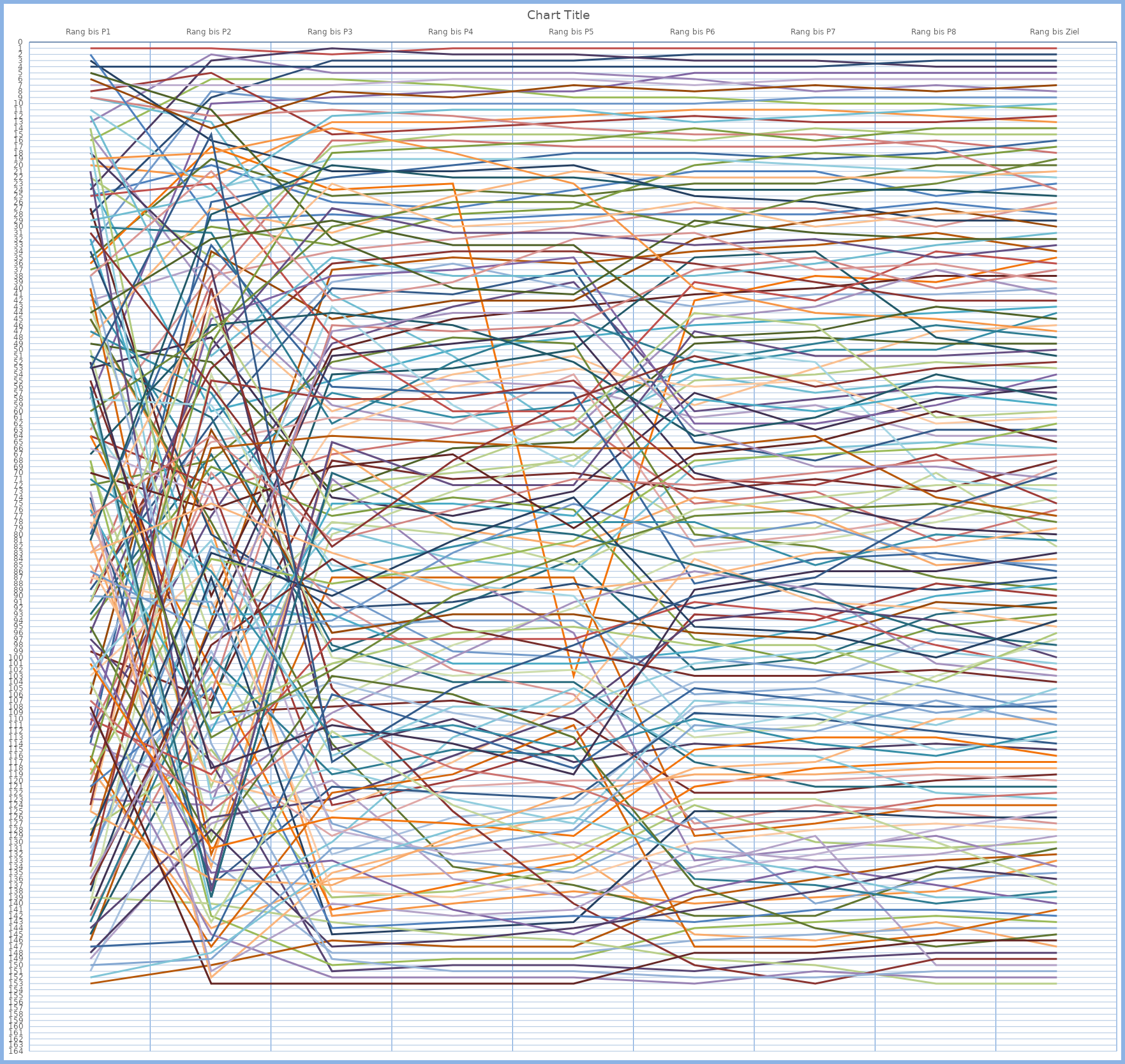
| Category | 1 | 2 | 3 | 4 | 5 | 6 | 7 | 8 | 9 | 10 | 11 | 12 | 13 | 14 | 15 | 16 | 17 | 18 | 19 | 20 | 21 | 22 | 23 | 24 | 25 | 26 | 27 | 28 | 29 | 30 | 31 | 32 | 33 | 34 | 35 | 36 | 37 | 38 | 39 | 40 | 41 | 42 | 43 | 44 | 45 | 46 | 47 | 48 | 49 | 50 | 51 | 52 | 53 | 54 | 55 | 56 | 57 | 58 | 59 | 60 | 61 | 62 | 63 | 64 | 65 | 66 | 67 | 68 | 69 | 70 | 71 | 72 | 73 | 74 | 75 | 76 | 77 | 78 | 79 | 80 | 81 | 82 | 83 | 84 | 85 | 86 | 87 | 88 | 89 | 90 | 91 | 92 | 93 | 94 | 95 | 96 | 97 | 98 | 99 | 100 | 101 | 102 | 103 | 104 | 105 | 106 | 107 | 108 | 109 | 110 | 111 | 112 | 113 | 114 | 115 | 116 | 117 | 118 | 119 | 120 | 121 | 122 | 123 | 124 | 125 | 126 | 127 | 128 | 129 | 130 | 131 | 132 | 133 | 134 | 135 | 136 | 137 | 138 | 139 | 140 | 141 | 142 | 143 | 144 | 145 | 146 | 147 | 148 | 149 | 150 | 151 | 152 | 153 | 154 | 155 | 156 | 157 | 158 | 159 | 160 | 161 | 162 | 163 |
|---|---|---|---|---|---|---|---|---|---|---|---|---|---|---|---|---|---|---|---|---|---|---|---|---|---|---|---|---|---|---|---|---|---|---|---|---|---|---|---|---|---|---|---|---|---|---|---|---|---|---|---|---|---|---|---|---|---|---|---|---|---|---|---|---|---|---|---|---|---|---|---|---|---|---|---|---|---|---|---|---|---|---|---|---|---|---|---|---|---|---|---|---|---|---|---|---|---|---|---|---|---|---|---|---|---|---|---|---|---|---|---|---|---|---|---|---|---|---|---|---|---|---|---|---|---|---|---|---|---|---|---|---|---|---|---|---|---|---|---|---|---|---|---|---|---|---|---|---|---|---|---|---|---|---|---|---|---|---|---|---|---|---|---|
| Rang bis P1 | 25 | 1 | 16 | 58 | 23 | 20 | 28 | 99 | 35 | 24 | 93 | 146 | 33 | 88 | 22 | 13 | 9 | 118 | 114 | 8 | 37 | 113 | 41 | 36 | 105 | 63 | 50 | 42 | 11 | 125 | 3 | 27 | 49 | 53 | 145 | 106 | 132 | 9 | 69 | 15 | 127 | 48 | 89 | 91 | 72 | 97 | 30 | 40 | 131 | 83 | 135 | 7 | 62 | 87 | 2 | 25 | 68 | 111 | 32 | 45 | 34 | 55 | 45 | 18 | 51 | 153 | 133 | 112 | 128 | 123 | 12 | 81 | 80 | 64 | 94 | 96 | 47 | 64 | 100 | 120 | 43 | 149 | 17 | 85 | 138 | 70 | 5 | 141 | 67 | 122 | 90 | 142 | 139 | 114 | 57 | 75 | 74 | 124 | 60 | 144 | 143 | 116 | 151 | 78 | 140 | 66 | 58 | 103 | 121 | 110 | 119 | 98 | 76 | 19 | 4 | 137 | 95 | 148 | 56 | 130 | 86 | 107 | 14 | 109 | 29 | 125 | 147 | 134 | 117 | 21 | 71 | 101 | 38 | 38 | 104 | 73 | 102 | 79 | 129 | 108 | 44 | 52 | 81 | 6 | 150 | 77 | 91 | 136 | 152 | 83 | 53 | 31 | 61 |  |  |  |  |  |  |  |  |  |  |
| Rang bis P2 | 20 | 1 | 6 | 10 | 60 | 22 | 9 | 107 | 19 | 3 | 67 | 94 | 8 | 39 | 35 | 2 | 13 | 144 | 26 | 5 | 30 | 77 | 71 | 17 | 58 | 38 | 129 | 36 | 24 | 43 | 16 | 90 | 52 | 48 | 108 | 34 | 88 | 12 | 121 | 41 | 103 | 27 | 62 | 53 | 68 | 117 | 31 | 132 | 99 | 65 | 104 | 7 | 89 | 92 | 29 | 23 | 142 | 45 | 93 | 79 | 80 | 109 | 78 | 37 | 61 | 150 | 82 | 73 | 115 | 124 | 51 | 134 | 33 | 72 | 69 | 50 | 57 | 102 | 133 | 70 | 97 | 127 | 123 | 120 | 87 | 76 | 11 | 95 | 46 | 63 | 91 | 106 | 140 | 122 | 141 | 152 | 137 | 40 | 47 | 126 | 100 | 147 | 111 | 116 | 54 | 74 | 59 | 85 | 105 | 119 | 84 | 135 | 112 | 18 | 4 | 98 | 130 | 128 | 139 | 66 | 96 | 125 | 110 | 145 | 25 | 136 | 146 | 55 | 49 | 138 | 86 | 131 | 114 | 21 | 143 | 151 | 81 | 42 | 83 | 153 | 32 | 118 | 28 | 14 | 149 | 64 | 44 | 101 | 148 | 75 | 15 | 56 | 113 |  |  |  |  |  |  |  |  |  |  |
| Rang bis P3 | 26 | 2 | 6 | 9 | 55 | 13 | 3 | 68 | 25 | 1 | 99 | 37 | 10 | 16 | 17 | 5 | 41 | 136 | 22 | 15 | 33 | 49 | 57 | 24 | 39 | 34 | 80 | 53 | 19 | 60 | 21 | 50 | 73 | 74 | 54 | 45 | 95 | 11 | 72 | 59 | 79 | 31 | 40 | 36 | 52 | 151 | 62 | 87 | 132 | 61 | 107 | 7 | 43 | 63 | 28 | 48 | 150 | 38 | 93 | 142 | 92 | 108 | 114 | 115 | 98 | 146 | 89 | 67 | 139 | 71 | 35 | 66 | 56 | 124 | 77 | 27 | 86 | 141 | 148 | 91 | 78 | 120 | 118 | 125 | 145 | 69 | 32 | 51 | 44 | 96 | 127 | 46 | 143 | 109 | 130 | 135 | 121 | 105 | 30 | 123 | 119 | 122 | 104 | 129 | 100 | 128 | 85 | 138 | 144 | 97 | 88 | 133 | 75 | 14 | 4 | 84 | 103 | 147 | 70 | 64 | 94 | 110 | 101 | 152 | 12 | 137 | 106 | 58 | 18 | 65 | 113 | 126 | 149 | 42 | 112 | 140 | 116 | 23 | 90 | 153 | 29 | 111 | 20 | 8 | 131 | 81 | 76 | 47 | 134 | 83 | 117 | 82 | 102 |  |  |  |  |  |  |  |  |  |  |
| Rang bis P4 | 27 | 1 | 7 | 8 | 50 | 13 | 3 | 71 | 24 | 2 | 92 | 35 | 10 | 16 | 15 | 5 | 51 | 135 | 20 | 14 | 28 | 43 | 61 | 23 | 36 | 32 | 73 | 55 | 19 | 54 | 21 | 45 | 66 | 77 | 53 | 42 | 94 | 12 | 70 | 63 | 84 | 25 | 41 | 34 | 48 | 150 | 52 | 87 | 126 | 62 | 98 | 6 | 59 | 56 | 29 | 60 | 149 | 37 | 101 | 140 | 91 | 107 | 134 | 110 | 104 | 147 | 99 | 64 | 138 | 86 | 38 | 79 | 57 | 120 | 74 | 31 | 82 | 137 | 148 | 102 | 80 | 136 | 123 | 117 | 144 | 67 | 40 | 49 | 46 | 93 | 133 | 47 | 145 | 100 | 113 | 130 | 122 | 125 | 26 | 116 | 115 | 119 | 109 | 121 | 103 | 132 | 88 | 139 | 143 | 97 | 85 | 141 | 75 | 18 | 4 | 95 | 106 | 146 | 78 | 65 | 83 | 118 | 96 | 152 | 11 | 129 | 112 | 58 | 17 | 72 | 111 | 127 | 151 | 39 | 124 | 142 | 108 | 30 | 81 | 153 | 33 | 114 | 22 | 9 | 131 | 76 | 69 | 44 | 128 | 89 | 105 | 68 | 90 |  |  |  |  |  |  |  |  |  |  |
| Rang bis P5 | 24 | 1 | 9 | 8 | 48 | 12 | 3 | 70 | 25 | 2 | 84 | 36 | 10 | 17 | 15 | 5 | 64 | 132 | 18 | 13 | 27 | 39 | 59 | 103 | 40 | 30 | 67 | 56 | 19 | 51 | 20 | 43 | 65 | 73 | 50 | 42 | 94 | 14 | 68 | 63 | 86 | 21 | 37 | 34 | 49 | 150 | 45 | 87 | 124 | 54 | 92 | 6 | 69 | 53 | 28 | 60 | 149 | 35 | 101 | 138 | 88 | 110 | 137 | 117 | 104 | 147 | 100 | 61 | 134 | 96 | 38 | 82 | 57 | 114 | 76 | 31 | 78 | 133 | 148 | 106 | 85 | 139 | 127 | 107 | 143 | 79 | 41 | 47 | 52 | 93 | 135 | 46 | 146 | 91 | 105 | 125 | 123 | 140 | 26 | 109 | 116 | 111 | 112 | 120 | 102 | 130 | 90 | 136 | 142 | 97 | 81 | 145 | 77 | 23 | 4 | 99 | 113 | 144 | 80 | 66 | 75 | 121 | 95 | 152 | 11 | 122 | 118 | 55 | 16 | 72 | 115 | 129 | 151 | 32 | 131 | 141 | 108 | 29 | 74 | 153 | 33 | 119 | 22 | 7 | 128 | 71 | 62 | 44 | 126 | 89 | 98 | 58 | 83 |  |  |  |  |  |  |  |  |  |  |
| Rang bis P6 | 21 | 1 | 9 | 5 | 46 | 11 | 2 | 73 | 23 | 3 | 102 | 34 | 10 | 17 | 16 | 6 | 54 | 145 | 18 | 12 | 20 | 60 | 53 | 42 | 43 | 27 | 79 | 61 | 19 | 59 | 25 | 41 | 49 | 57 | 35 | 32 | 106 | 15 | 55 | 45 | 69 | 22 | 65 | 36 | 80 | 151 | 52 | 129 | 108 | 82 | 83 | 7 | 50 | 56 | 28 | 39 | 144 | 62 | 99 | 140 | 92 | 122 | 142 | 114 | 117 | 139 | 100 | 75 | 124 | 133 | 38 | 74 | 88 | 93 | 97 | 33 | 78 | 121 | 146 | 127 | 76 | 134 | 107 | 84 | 125 | 67 | 29 | 70 | 64 | 96 | 126 | 37 | 149 | 86 | 116 | 118 | 109 | 150 | 30 | 94 | 136 | 147 | 104 | 120 | 113 | 135 | 112 | 130 | 143 | 91 | 68 | 138 | 58 | 40 | 4 | 103 | 137 | 141 | 85 | 66 | 81 | 128 | 98 | 153 | 13 | 119 | 105 | 71 | 14 | 47 | 110 | 115 | 152 | 31 | 123 | 131 | 101 | 26 | 95 | 148 | 48 | 89 | 24 | 8 | 111 | 72 | 44 | 63 | 132 | 87 | 90 | 51 | 77 |  |  |  |  |  |  |  |  |  |  |
| Rang bis P7 | 21 | 1 | 10 | 5 | 45 | 11 | 2 | 71 | 23 | 3 | 100 | 33 | 9 | 17 | 14 | 8 | 57 | 146 | 19 | 13 | 18 | 58 | 50 | 38 | 41 | 27 | 79 | 59 | 20 | 53 | 26 | 40 | 48 | 63 | 34 | 29 | 105 | 15 | 54 | 43 | 66 | 22 | 68 | 39 | 82 | 149 | 49 | 127 | 106 | 80 | 81 | 6 | 52 | 55 | 28 | 42 | 143 | 62 | 95 | 139 | 88 | 122 | 142 | 115 | 121 | 136 | 102 | 73 | 130 | 131 | 36 | 77 | 84 | 94 | 101 | 32 | 85 | 118 | 145 | 124 | 74 | 129 | 108 | 91 | 125 | 65 | 31 | 75 | 61 | 97 | 140 | 35 | 150 | 89 | 116 | 117 | 110 | 153 | 25 | 92 | 137 | 147 | 104 | 120 | 111 | 132 | 109 | 128 | 141 | 93 | 67 | 134 | 60 | 44 | 4 | 103 | 144 | 138 | 90 | 64 | 78 | 126 | 98 | 151 | 12 | 119 | 107 | 72 | 16 | 51 | 114 | 113 | 152 | 37 | 123 | 133 | 99 | 30 | 96 | 148 | 47 | 86 | 24 | 7 | 112 | 70 | 46 | 69 | 135 | 83 | 87 | 56 | 76 |  |  |  |  |  |  |  |  |  |  |
| Rang bis P8 | 25 | 1 | 10 | 5 | 44 | 12 | 2 | 73 | 20 | 4 | 93 | 31 | 9 | 16 | 15 | 7 | 55 | 143 | 18 | 13 | 19 | 56 | 50 | 39 | 41 | 30 | 70 | 64 | 21 | 47 | 29 | 38 | 49 | 58 | 48 | 27 | 109 | 17 | 52 | 37 | 65 | 22 | 63 | 42 | 87 | 148 | 46 | 124 | 106 | 77 | 78 | 6 | 71 | 62 | 26 | 34 | 142 | 59 | 90 | 138 | 89 | 120 | 135 | 114 | 121 | 133 | 105 | 81 | 131 | 129 | 33 | 85 | 83 | 88 | 95 | 35 | 80 | 117 | 144 | 125 | 72 | 150 | 111 | 92 | 126 | 60 | 32 | 79 | 54 | 91 | 136 | 40 | 153 | 101 | 122 | 110 | 112 | 149 | 23 | 94 | 140 | 145 | 97 | 119 | 103 | 128 | 115 | 127 | 141 | 98 | 66 | 137 | 57 | 45 | 3 | 102 | 147 | 134 | 96 | 74 | 84 | 123 | 104 | 152 | 11 | 118 | 108 | 67 | 14 | 51 | 116 | 113 | 151 | 36 | 130 | 132 | 99 | 28 | 100 | 146 | 43 | 86 | 24 | 8 | 107 | 68 | 61 | 69 | 139 | 82 | 76 | 53 | 75 |  |  |  |  |  |  |  |  |  |  |
| Rang bis Ziel | 23 | 1 | 11 | 5 | 43 | 13 | 2 | 68 | 20 | 4 | 91 | 34 | 9 | 18 | 15 | 8 | 55 | 147 | 16 | 12 | 17 | 57 | 44 | 35 | 40 | 26 | 82 | 64 | 22 | 46 | 29 | 38 | 49 | 56 | 51 | 30 | 107 | 24 | 53 | 41 | 66 | 21 | 63 | 42 | 89 | 148 | 48 | 124 | 106 | 69 | 74 | 6 | 73 | 61 | 28 | 36 | 143 | 54 | 88 | 133 | 87 | 119 | 131 | 115 | 121 | 132 | 109 | 76 | 130 | 134 | 31 | 84 | 86 | 90 | 93 | 33 | 81 | 117 | 144 | 127 | 72 | 150 | 105 | 95 | 126 | 65 | 32 | 80 | 58 | 92 | 135 | 37 | 153 | 103 | 123 | 110 | 114 | 149 | 19 | 100 | 138 | 141 | 99 | 120 | 97 | 125 | 113 | 128 | 142 | 102 | 62 | 140 | 59 | 47 | 3 | 104 | 145 | 136 | 98 | 77 | 85 | 122 | 96 | 152 | 10 | 118 | 108 | 75 | 14 | 50 | 112 | 116 | 151 | 39 | 137 | 129 | 101 | 27 | 94 | 146 | 45 | 83 | 25 | 7 | 111 | 67 | 60 | 71 | 139 | 79 | 70 | 52 | 78 |  |  |  |  |  |  |  |  |  |  |